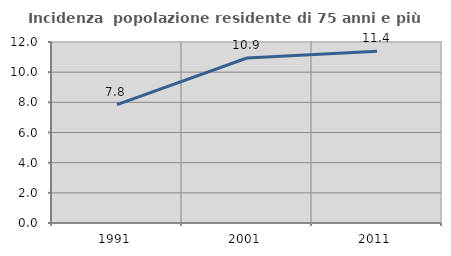
| Category | Incidenza  popolazione residente di 75 anni e più |
|---|---|
| 1991.0 | 7.843 |
| 2001.0 | 10.938 |
| 2011.0 | 11.395 |